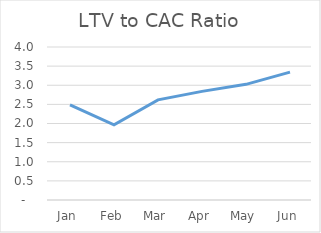
| Category | LTV to CAC Ratio |
|---|---|
| Jan | 2.484 |
| Feb | 1.964 |
| Mar | 2.617 |
| Apr | 2.839 |
| May | 3.024 |
| Jun | 3.343 |